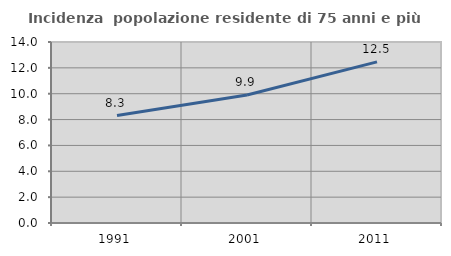
| Category | Incidenza  popolazione residente di 75 anni e più |
|---|---|
| 1991.0 | 8.307 |
| 2001.0 | 9.901 |
| 2011.0 | 12.462 |